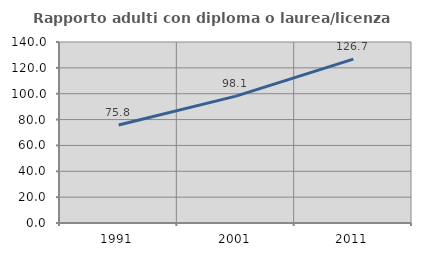
| Category | Rapporto adulti con diploma o laurea/licenza media  |
|---|---|
| 1991.0 | 75.825 |
| 2001.0 | 98.102 |
| 2011.0 | 126.747 |